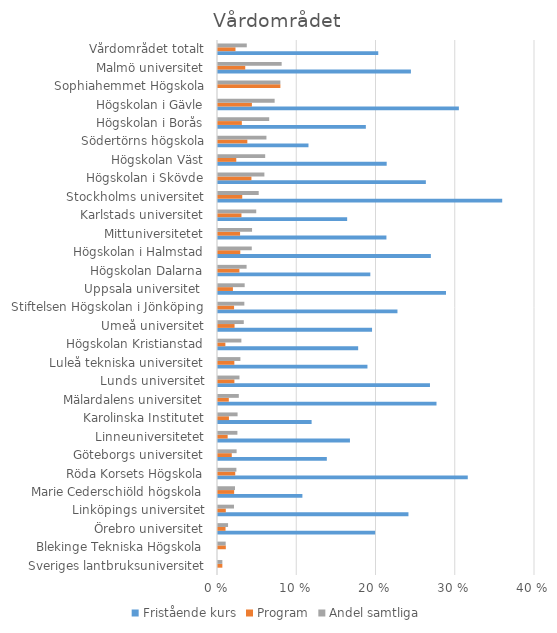
| Category | Fristående kurs | Program | Andel samtliga |
|---|---|---|---|
| Sveriges lantbruksuniversitet | 0 | 0.005 | 0.005 |
| Blekinge Tekniska Högskola | 0 | 0.01 | 0.01 |
| Örebro universitet | 0.198 | 0.01 | 0.013 |
| Linköpings universitet | 0.24 | 0.01 | 0.02 |
| Marie Cederschiöld högskola | 0.106 | 0.02 | 0.021 |
| Röda Korsets Högskola | 0.315 | 0.022 | 0.023 |
| Göteborgs universitet | 0.137 | 0.017 | 0.023 |
| Linneuniversitetet | 0.166 | 0.012 | 0.024 |
| Karolinska Institutet | 0.118 | 0.014 | 0.025 |
| Mälardalens universitet | 0.276 | 0.014 | 0.026 |
| Lunds universitet | 0.267 | 0.021 | 0.027 |
| Luleå tekniska universitet | 0.189 | 0.021 | 0.028 |
| Högskolan Kristianstad | 0.177 | 0.009 | 0.029 |
| Umeå universitet | 0.194 | 0.021 | 0.033 |
| Stiftelsen Högskolan i Jönköping | 0.226 | 0.02 | 0.033 |
| Uppsala universitet  | 0.288 | 0.019 | 0.034 |
| Högskolan Dalarna | 0.192 | 0.027 | 0.036 |
| Högskolan i Halmstad | 0.269 | 0.028 | 0.043 |
| Mittuniversitetet | 0.213 | 0.028 | 0.043 |
| Karlstads universitet | 0.163 | 0.03 | 0.048 |
| Stockholms universitet | 0.359 | 0.031 | 0.051 |
| Högskolan i Skövde | 0.262 | 0.042 | 0.059 |
| Högskolan Väst | 0.213 | 0.023 | 0.06 |
| Södertörns högskola | 0.114 | 0.037 | 0.061 |
| Högskolan i Borås | 0.187 | 0.03 | 0.065 |
| Högskolan i Gävle | 0.304 | 0.043 | 0.071 |
| Sophiahemmet Högskola | 0 | 0.079 | 0.079 |
| Malmö universitet | 0.243 | 0.034 | 0.08 |
| Vårdområdet totalt | 0.202 | 0.022 | 0.036 |